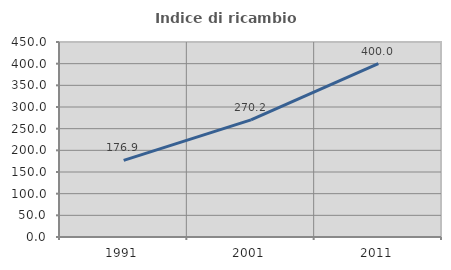
| Category | Indice di ricambio occupazionale  |
|---|---|
| 1991.0 | 176.923 |
| 2001.0 | 270.175 |
| 2011.0 | 400 |